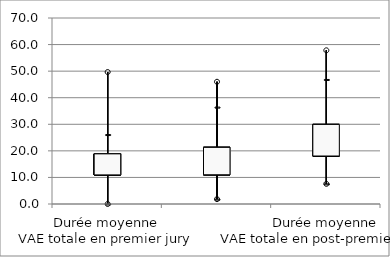
| Category | Series 0 | Series 1 | Series 2 | Series 3 | Series 4 | Series 5 | Series 6 | Series 7 |
|---|---|---|---|---|---|---|---|---|
| Durée moyenne
VAE totale en premier jury | 10.95 | 0.004 | 0.004 | 14.734 | 15.227 | 26.133 | 49.667 | 18.875 |
| Durée moyenne
VAE partielle en premier jury | 11 | 1.833 | 1.833 | 14.967 | 16.773 | 36.467 | 46 | 21.317 |
| Durée moyenne
VAE totale en post-premier jury | 18.064 | 7.583 | 7.583 | 24.433 | 25.125 | 46.867 | 57.833 | 29.95 |